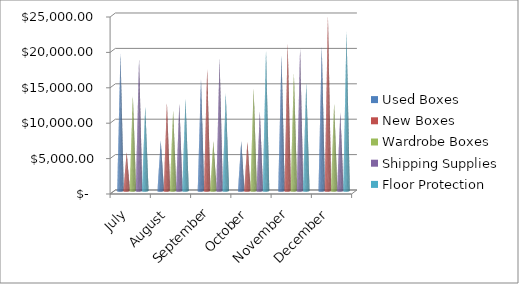
| Category | Used Boxes | New Boxes | Wardrobe Boxes | Shipping Supplies | Floor Protection |
|---|---|---|---|---|---|
| July | 19370.29 | 5463.28 | 13445.57 | 18606.19 | 11918.95 |
| August | 7128.81 | 12396.92 | 11329.1 | 12374.48 | 13059.59 |
| September | 15788.83 | 17220.22 | 7072.1 | 18735.63 | 13858.03 |
| October | 7062.43 | 6956.54 | 14500.49 | 11181.19 | 19821.4 |
| November | 19197.53 | 20880.71 | 16611.87 | 20112.33 | 15257.57 |
| December | 20420.22 | 24739.41 | 12325.39 | 11134.48 | 22512.89 |